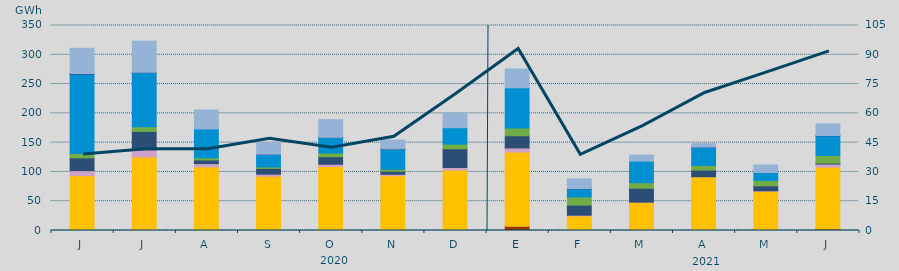
| Category | Carbón | Ciclo Combinado | Cogeneración | Consumo Bombeo | Eólica | Hidráulica | Nuclear | Solar fotovoltaica | Turbinación bombeo |
|---|---|---|---|---|---|---|---|---|---|
| J | 105 | 93533.6 | 8541.6 | 21857.1 | 7292.6 | 135598.7 | 1073 | 2 | 43074.4 |
| J | 50 | 125585.6 | 12039 | 31594.3 | 7693.1 | 93034.8 | 70 | 4 | 53243.2 |
| A | 0 | 108564.2 | 5645 | 6241.6 | 3597 | 49376 | 0 | 0 | 32334.2 |
| S | 50 | 92799.2 | 3342.1 | 9830.5 | 2500.3 | 21849.9 | 0 | 1 | 19451 |
| O | 3 | 109201.7 | 3918.6 | 12821.2 | 6372.3 | 26600.6 | 125 | 8 | 30188 |
| N | 213 | 93256.6 | 2563.1 | 5075 | 3418.9 | 34915.3 | 44 | 1 | 14986.7 |
| D | 262 | 103017.6 | 4284.9 | 31984.7 | 7901.9 | 28032.3 | 0 | 0 | 24956.6 |
| E | 7444 | 126506.9 | 6978.7 | 20802.6 | 13159.6 | 68727.9 | 0 | 0 | 32220.5 |
| F | 80.8 | 24841.5 | 1216 | 17221.1 | 13957 | 13816.2 | 518.3 | 0 | 16521.3 |
| M | 40 | 48251 | 165.1 | 23774.6 | 9419.8 | 36880.2 | 0 | 0 | 10235.7 |
| A | 1272 | 90553.5 | 28 | 11321.6 | 7721.9 | 31277.5 | 355 | 0 | 5841.7 |
| M | 1218 | 65765 | 840.7 | 8400.9 | 9305.2 | 13438.2 | 143 | 0 | 12740.8 |
| J | 2620 | 105576.1 | 5187.8 | 1697 | 12843.8 | 33778.9 | 555 | 0 | 19791.2 |